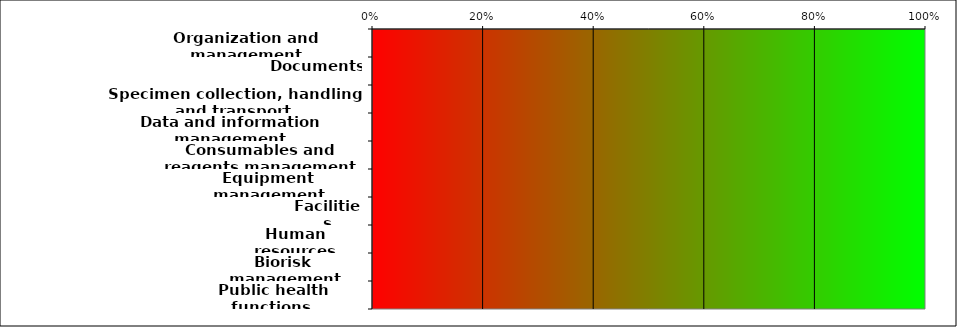
| Category | Series 7 |
|---|---|
| Organization and management | 0 |
| Documents | 0 |
| Specimen collection, handling and transport | 0 |
| Data and information management | 0 |
| Consumables and reagents management | 0 |
| Equipment management | 0 |
| Facilities | 0 |
| Human resources | 0 |
| Biorisk management | 0 |
| Public health functions  | 0 |